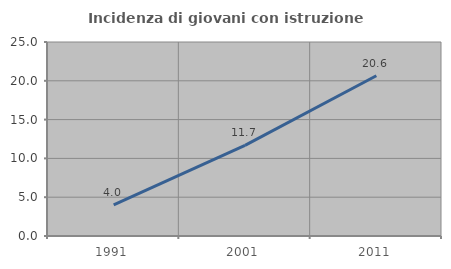
| Category | Incidenza di giovani con istruzione universitaria |
|---|---|
| 1991.0 | 4.023 |
| 2001.0 | 11.669 |
| 2011.0 | 20.646 |